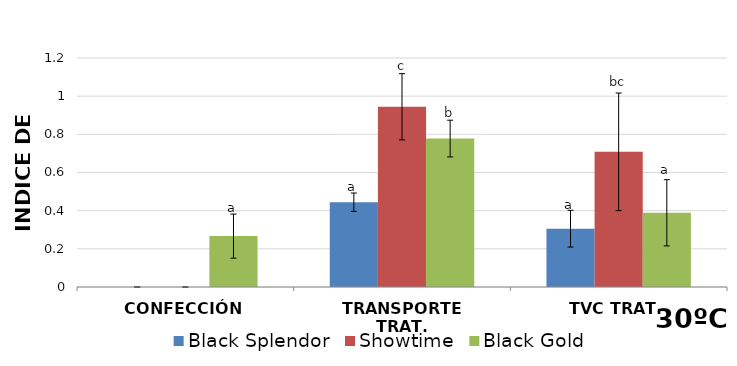
| Category | Black Splendor | Showtime | Black Gold |
|---|---|---|---|
| CONFECCIÓN | 0 | 0 | 0.267 |
| TRANSPORTE TRAT. | 0.444 | 0.944 | 0.778 |
| TVC TRAT. | 0.306 | 0.708 | 0.389 |